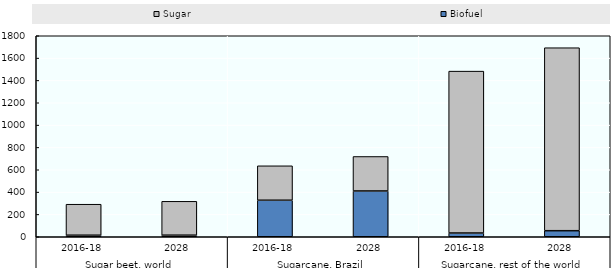
| Category | Biofuel | Sugar  |
|---|---|---|
| 0 | 13.836 | 277.522 |
| 1 | 14.076 | 303.29 |
| 2 | 327.019 | 308.409 |
| 3 | 409.846 | 309.063 |
| 4 | 33.537 | 1449.748 |
| 5 | 54.22 | 1638.643 |